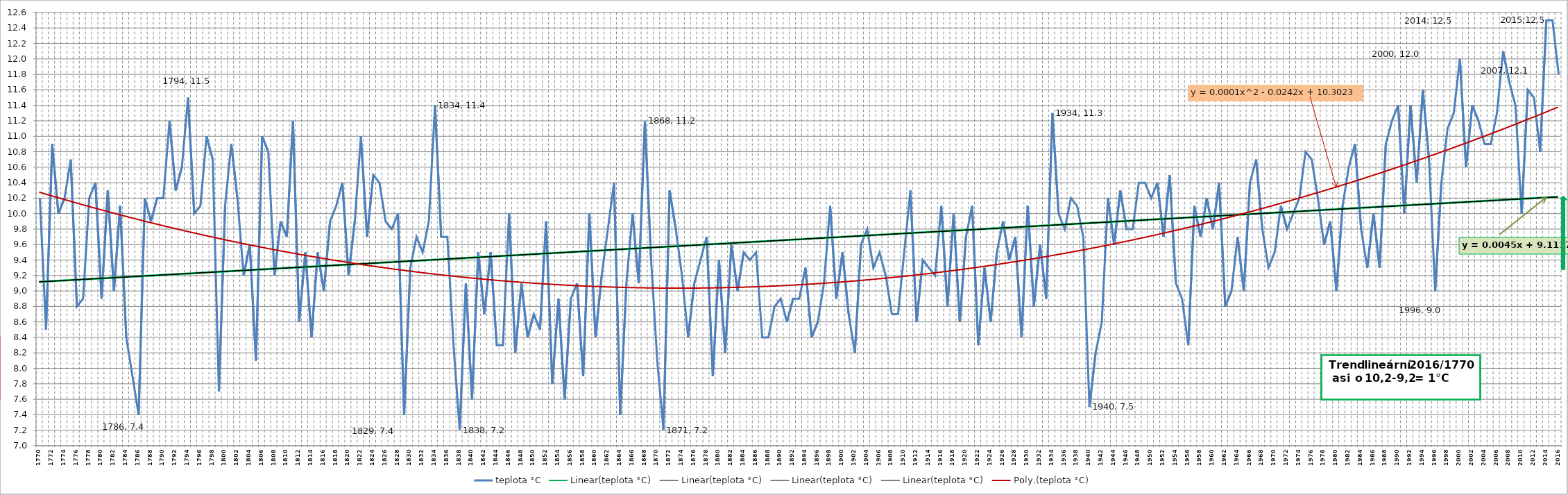
| Category | teplota °C |
|---|---|
| 1770 | 10.2 |
| 1771 | 8.5 |
| 1772 | 10.9 |
| 1773 | 10 |
| 1774 | 10.2 |
| 1775 | 10.7 |
| 1776 | 8.8 |
| 1777 | 8.9 |
| 1778 | 10.2 |
| 1779 | 10.4 |
| 1780 | 8.9 |
| 1781 | 10.3 |
| 1782 | 9 |
| 1783 | 10.1 |
| 1784 | 8.4 |
| 1785 | 7.9 |
| 1786 | 7.4 |
| 1787 | 10.2 |
| 1788 | 9.9 |
| 1789 | 10.2 |
| 1790 | 10.2 |
| 1791 | 11.2 |
| 1792 | 10.3 |
| 1793 | 10.6 |
| 1794 | 11.5 |
| 1795 | 10 |
| 1796 | 10.1 |
| 1797 | 11 |
| 1798 | 10.7 |
| 1799 | 7.7 |
| 1800 | 10.1 |
| 1801 | 10.9 |
| 1802 | 10.2 |
| 1803 | 9.2 |
| 1804 | 9.6 |
| 1805 | 8.1 |
| 1806 | 11 |
| 1807 | 10.8 |
| 1808 | 9.2 |
| 1809 | 9.9 |
| 1810 | 9.7 |
| 1811 | 11.2 |
| 1812 | 8.6 |
| 1813 | 9.5 |
| 1814 | 8.4 |
| 1815 | 9.5 |
| 1816 | 9 |
| 1817 | 9.9 |
| 1818 | 10.1 |
| 1819 | 10.4 |
| 1820 | 9.2 |
| 1821 | 9.9 |
| 1822 | 11 |
| 1823 | 9.7 |
| 1824 | 10.5 |
| 1825 | 10.4 |
| 1826 | 9.9 |
| 1827 | 9.8 |
| 1828 | 10 |
| 1829 | 7.4 |
| 1830 | 9.3 |
| 1831 | 9.7 |
| 1832 | 9.5 |
| 1833 | 9.9 |
| 1834 | 11.4 |
| 1835 | 9.7 |
| 1836 | 9.7 |
| 1837 | 8.3 |
| 1838 | 7.2 |
| 1839 | 9.1 |
| 1840 | 7.6 |
| 1841 | 9.5 |
| 1842 | 8.7 |
| 1843 | 9.5 |
| 1844 | 8.3 |
| 1845 | 8.3 |
| 1846 | 10 |
| 1847 | 8.2 |
| 1848 | 9.1 |
| 1849 | 8.4 |
| 1850 | 8.7 |
| 1851 | 8.5 |
| 1852 | 9.9 |
| 1853 | 7.8 |
| 1854 | 8.9 |
| 1855 | 7.6 |
| 1856 | 8.9 |
| 1857 | 9.1 |
| 1858 | 7.9 |
| 1859 | 10 |
| 1860 | 8.4 |
| 1861 | 9.2 |
| 1862 | 9.8 |
| 1863 | 10.4 |
| 1864 | 7.4 |
| 1865 | 9.1 |
| 1866 | 10 |
| 1867 | 9.1 |
| 1868 | 11.2 |
| 1869 | 9.4 |
| 1870 | 8.1 |
| 1871 | 7.2 |
| 1872 | 10.3 |
| 1873 | 9.8 |
| 1874 | 9.2 |
| 1875 | 8.4 |
| 1876 | 9.1 |
| 1877 | 9.4 |
| 1878 | 9.7 |
| 1879 | 7.9 |
| 1880 | 9.4 |
| 1881 | 8.2 |
| 1882 | 9.6 |
| 1883 | 9 |
| 1884 | 9.5 |
| 1885 | 9.4 |
| 1886 | 9.5 |
| 1887 | 8.4 |
| 1888 | 8.4 |
| 1889 | 8.8 |
| 1890 | 8.9 |
| 1891 | 8.6 |
| 1892 | 8.9 |
| 1893 | 8.9 |
| 1894 | 9.3 |
| 1895 | 8.4 |
| 1896 | 8.6 |
| 1897 | 9.1 |
| 1898 | 10.1 |
| 1899 | 8.9 |
| 1900 | 9.5 |
| 1901 | 8.7 |
| 1902 | 8.2 |
| 1903 | 9.6 |
| 1904 | 9.8 |
| 1905 | 9.3 |
| 1906 | 9.5 |
| 1907 | 9.2 |
| 1908 | 8.7 |
| 1909 | 8.7 |
| 1910 | 9.5 |
| 1911 | 10.3 |
| 1912 | 8.6 |
| 1913 | 9.4 |
| 1914 | 9.3 |
| 1915 | 9.2 |
| 1916 | 10.1 |
| 1917 | 8.8 |
| 1918 | 10 |
| 1919 | 8.6 |
| 1920 | 9.7 |
| 1921 | 10.1 |
| 1922 | 8.3 |
| 1923 | 9.3 |
| 1924 | 8.6 |
| 1925 | 9.5 |
| 1926 | 9.9 |
| 1927 | 9.4 |
| 1928 | 9.7 |
| 1929 | 8.4 |
| 1930 | 10.1 |
| 1931 | 8.8 |
| 1932 | 9.6 |
| 1933 | 8.9 |
| 1934 | 11.3 |
| 1935 | 10 |
| 1936 | 9.8 |
| 1937 | 10.2 |
| 1938 | 10.1 |
| 1939 | 9.7 |
| 1940 | 7.5 |
| 1941 | 8.2 |
| 1942 | 8.6 |
| 1943 | 10.2 |
| 1944 | 9.6 |
| 1945 | 10.3 |
| 1946 | 9.8 |
| 1947 | 9.8 |
| 1948 | 10.4 |
| 1949 | 10.4 |
| 1950 | 10.2 |
| 1951 | 10.4 |
| 1952 | 9.7 |
| 1953 | 10.5 |
| 1954 | 9.1 |
| 1955 | 8.9 |
| 1956 | 8.3 |
| 1957 | 10.1 |
| 1958 | 9.7 |
| 1959 | 10.2 |
| 1960 | 9.8 |
| 1961 | 10.4 |
| 1962 | 8.8 |
| 1963 | 9 |
| 1964 | 9.7 |
| 1965 | 9 |
| 1966 | 10.4 |
| 1967 | 10.7 |
| 1968 | 9.8 |
| 1969 | 9.3 |
| 1970 | 9.5 |
| 1971 | 10.1 |
| 1972 | 9.8 |
| 1973 | 10 |
| 1974 | 10.2 |
| 1975 | 10.8 |
| 1976 | 10.7 |
| 1977 | 10.2 |
| 1978 | 9.6 |
| 1979 | 9.9 |
| 1980 | 9 |
| 1981 | 10.1 |
| 1982 | 10.6 |
| 1983 | 10.9 |
| 1984 | 9.8 |
| 1985 | 9.3 |
| 1986 | 10 |
| 1987 | 9.3 |
| 1988 | 10.9 |
| 1989 | 11.2 |
| 1990 | 11.4 |
| 1991 | 10 |
| 1992 | 11.4 |
| 1993 | 10.4 |
| 1994 | 11.6 |
| 1995 | 10.7 |
| 1996 | 9 |
| 1997 | 10.4 |
| 1998 | 11.1 |
| 1999 | 11.3 |
| 2000 | 12 |
| 2001 | 10.6 |
| 2002 | 11.4 |
| 2003 | 11.2 |
| 2004 | 10.9 |
| 2005 | 10.9 |
| 2006 | 11.3 |
| 2007 | 12.1 |
| 2008 | 11.7 |
| 2009 | 11.4 |
| 2010 | 10 |
| 2011 | 11.6 |
| 2012 | 11.5 |
| 2013 | 10.8 |
| 2014 | 12.5 |
| 2015 | 12.5 |
| 2016 | 11.8 |